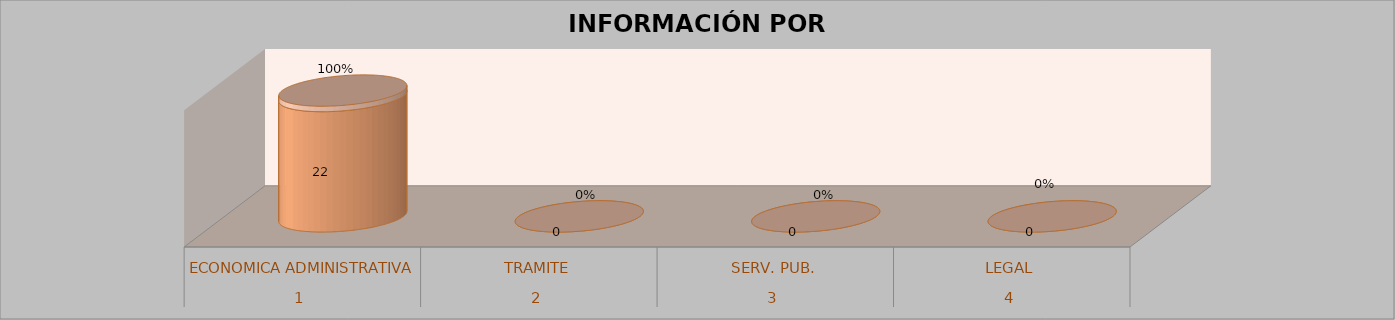
| Category | Series 0 | Series 1 | Series 2 | Series 3 |
|---|---|---|---|---|
| 0 |  |  | 22 | 1 |
| 1 |  |  | 0 | 0 |
| 2 |  |  | 0 | 0 |
| 3 |  |  | 0 | 0 |